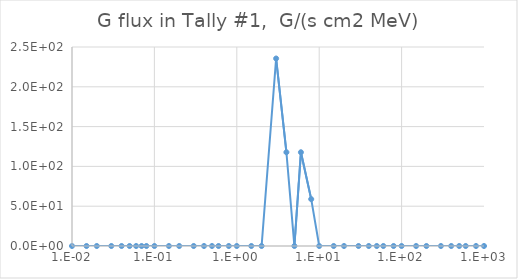
| Category | Series 0 |
|---|---|
| 0.01 | 0 |
| 0.015 | 0 |
| 0.02 | 0 |
| 0.03 | 0 |
| 0.04 | 0 |
| 0.05 | 0 |
| 0.06 | 0 |
| 0.07 | 0 |
| 0.08 | 0 |
| 0.1 | 0 |
| 0.15 | 0 |
| 0.2 | 0 |
| 0.3 | 0 |
| 0.4 | 0 |
| 0.5 | 0 |
| 0.6 | 0 |
| 0.8 | 0 |
| 1.0 | 0 |
| 1.5 | 144.205 |
| 2.0 | 432.611 |
| 3.0 | 3460.88 |
| 4.0 | 7642.79 |
| 5.0 | 6777.56 |
| 6.0 | 2739.87 |
| 8.0 | 3605.083 |
| 10.0 | 865.221 |
| 15.0 | 1153.63 |
| 20.0 | 0 |
| 30.0 | 0 |
| 40.0 | 0 |
| 50.0 | 0 |
| 60.0 | 0 |
| 80.0 | 0 |
| 100.0 | 0 |
| 150.0 | 0 |
| 200.0 | 0 |
| 300.0 | 0 |
| 400.0 | 0 |
| 500.0 | 0 |
| 600.0 | 0 |
| 800.0 | 0 |
| 1000.0 | 0 |
| 1500.0 | 0 |
| 2000.0 | 0 |
| 3000.0 | 0 |
| 4000.0 | 0 |
| 5000.0 | 0 |
| 6000.0 | 0 |
| 8000.0 | 0 |
| 10000.0 | 0 |